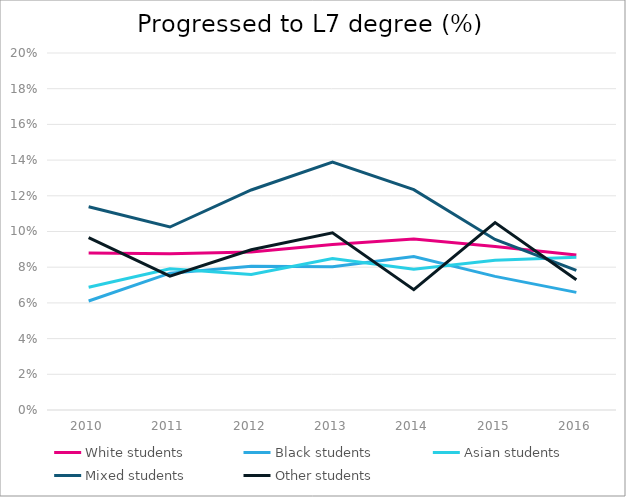
| Category | White students | Black students | Asian students | Mixed students | Other students |
|---|---|---|---|---|---|
| 2010.0 | 0.088 | 0.061 | 0.069 | 0.114 | 0.097 |
| 2011.0 | 0.088 | 0.077 | 0.079 | 0.103 | 0.075 |
| 2012.0 | 0.089 | 0.081 | 0.076 | 0.123 | 0.09 |
| 2013.0 | 0.093 | 0.08 | 0.085 | 0.139 | 0.099 |
| 2014.0 | 0.096 | 0.086 | 0.079 | 0.123 | 0.067 |
| 2015.0 | 0.092 | 0.075 | 0.084 | 0.096 | 0.105 |
| 2016.0 | 0.087 | 0.066 | 0.086 | 0.078 | 0.073 |